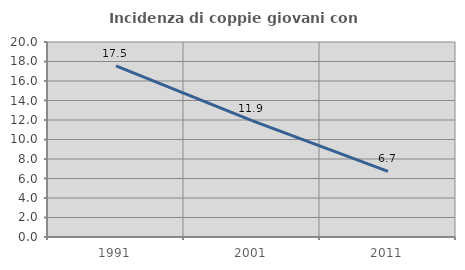
| Category | Incidenza di coppie giovani con figli |
|---|---|
| 1991.0 | 17.545 |
| 2001.0 | 11.939 |
| 2011.0 | 6.733 |